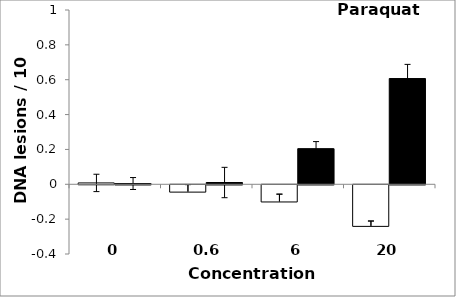
| Category | Nuc | Mito |
|---|---|---|
| 0.0 | 0.008 | 0.004 |
| 0.6 | -0.042 | 0.01 |
| 6.0 | -0.099 | 0.205 |
| 20.0 | -0.239 | 0.607 |